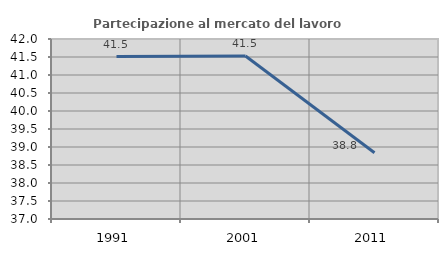
| Category | Partecipazione al mercato del lavoro  femminile |
|---|---|
| 1991.0 | 41.512 |
| 2001.0 | 41.529 |
| 2011.0 | 38.841 |